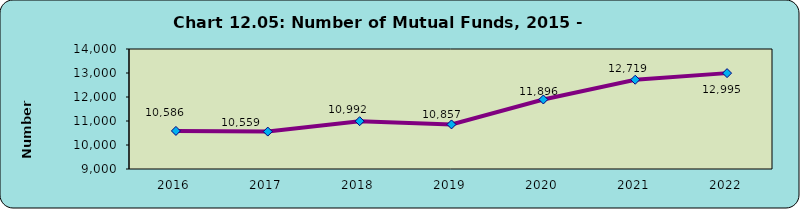
| Category | Mutual Funds |
|---|---|
| 2016.0 | 10586 |
| 2017.0 | 10559 |
| 2018.0 | 10992 |
| 2019.0 | 10857 |
| 2020.0 | 11896 |
| 2021.0 | 12719 |
| 2022.0 | 12995 |